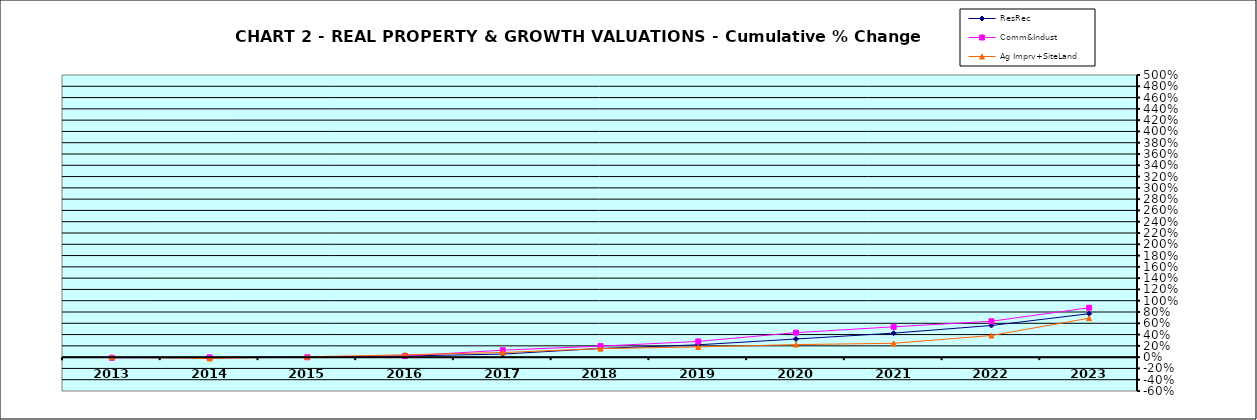
| Category | ResRec | Comm&Indust | Ag Imprv+SiteLand |
|---|---|---|---|
| 2013.0 | -0.009 | -0.011 | 0 |
| 2014.0 | -0.008 | -0.004 | -0.024 |
| 2015.0 | 0.003 | -0.002 | 0.007 |
| 2016.0 | 0.02 | 0.021 | 0.041 |
| 2017.0 | 0.055 | 0.123 | 0.082 |
| 2018.0 | 0.154 | 0.195 | 0.151 |
| 2019.0 | 0.219 | 0.278 | 0.181 |
| 2020.0 | 0.321 | 0.435 | 0.223 |
| 2021.0 | 0.426 | 0.537 | 0.245 |
| 2022.0 | 0.561 | 0.636 | 0.384 |
| 2023.0 | 0.77 | 0.875 | 0.691 |